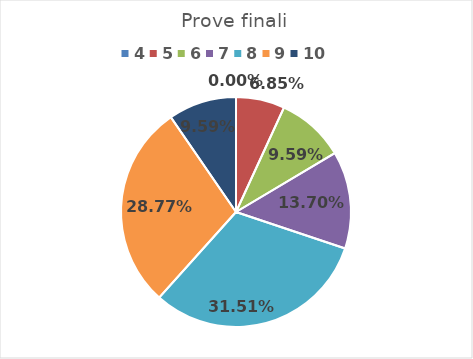
| Category | Series 0 |
|---|---|
| 4.0 | 0 |
| 5.0 | 0.068 |
| 6.0 | 0.096 |
| 7.0 | 0.137 |
| 8.0 | 0.315 |
| 9.0 | 0.288 |
| 10.0 | 0.096 |